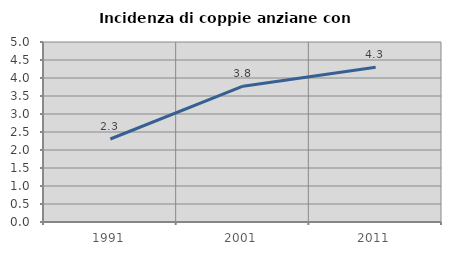
| Category | Incidenza di coppie anziane con figli |
|---|---|
| 1991.0 | 2.305 |
| 2001.0 | 3.774 |
| 2011.0 | 4.297 |